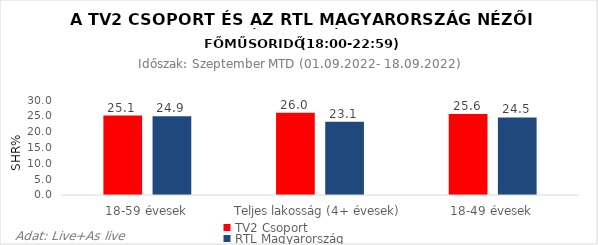
| Category | TV2 Csoport | RTL Magyarország |
|---|---|---|
| 18-59 évesek | 25.1 | 24.9 |
| Teljes lakosság (4+ évesek) | 26 | 23.1 |
| 18-49 évesek | 25.6 | 24.5 |